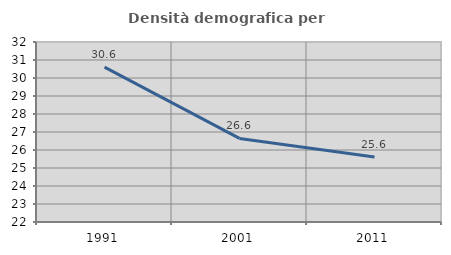
| Category | Densità demografica |
|---|---|
| 1991.0 | 30.605 |
| 2001.0 | 26.644 |
| 2011.0 | 25.608 |